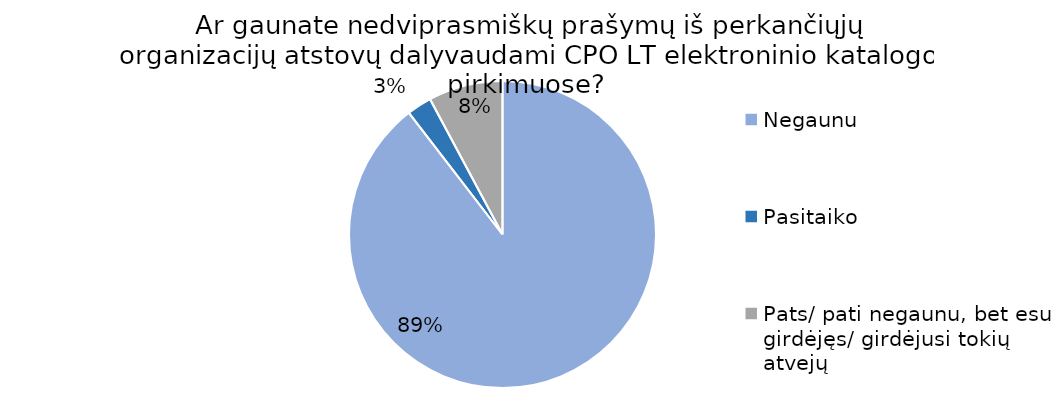
| Category | Series 0 |
|---|---|
| Negaunu | 103 |
| Pasitaiko | 3 |
| Pats/ pati negaunu, bet esu girdėjęs/ girdėjusi tokių atvejų | 9 |